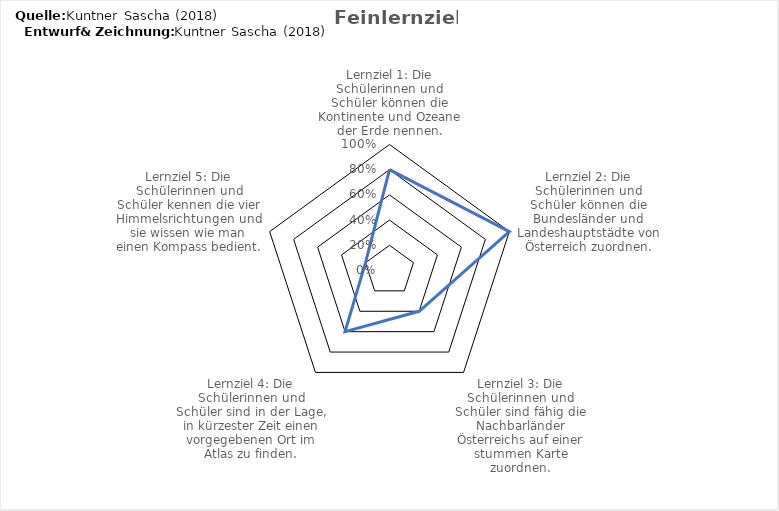
| Category | Series 0 |
|---|---|
| Lernziel 1: Die Schülerinnen und Schüler können die Kontinente und Ozeane der Erde nennen. | 0.8 |
| Lernziel 2: Die Schülerinnen und Schüler können die Bundesländer und Landeshauptstädte von Österreich zuordnen. | 1 |
| Lernziel 3: Die Schülerinnen und Schüler sind fähig die Nachbarländer Österreichs auf einer stummen Karte zuordnen. | 0.4 |
| Lernziel 4: Die Schülerinnen und Schüler sind in der Lage, in kürzester Zeit einen vorgegebenen Ort im Atlas zu finden. | 0.6 |
| Lernziel 5: Die Schülerinnen und Schüler kennen die vier Himmelsrichtungen und sie wissen wie man einen Kompass bedient. | 0.2 |